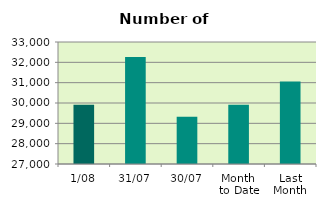
| Category | Series 0 |
|---|---|
| 1/08 | 29920 |
| 31/07 | 32258 |
| 30/07 | 29322 |
| Month 
to Date | 29920 |
| Last
Month | 31061.545 |